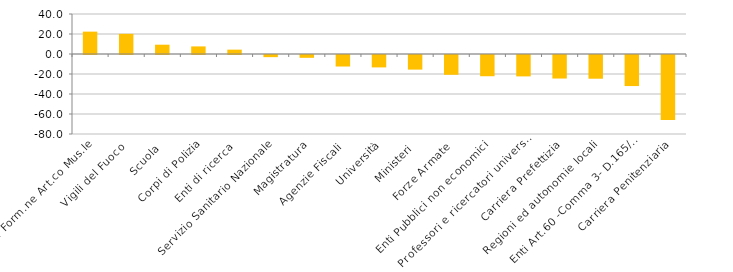
| Category | Series 0 |
|---|---|
| Ist. Form.ne Art.co Mus.le | 22.364 |
| Vigili del Fuoco | 20.159 |
| Scuola | 9.297 |
| Corpi di Polizia | 7.589 |
| Enti di ricerca | 4.348 |
| Servizio Sanitario Nazionale | -2.146 |
| Magistratura | -2.817 |
| Agenzie Fiscali | -11.512 |
| Università | -12.402 |
| Ministeri | -14.604 |
| Forze Armate | -19.785 |
| Enti Pubblici non economici | -21.229 |
| Professori e ricercatori universitari | -21.385 |
| Carriera Prefettizia | -23.529 |
| Regioni ed autonomie locali | -23.707 |
| Enti Art.60 -Comma 3- D.165/01 | -31.061 |
| Carriera Penitenziaria | -65 |